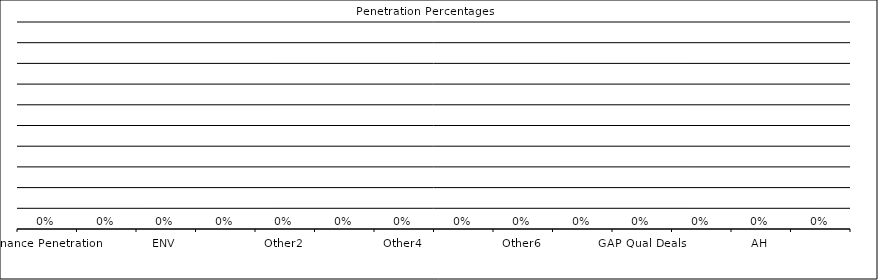
| Category | Penetration Percentages |
|---|---|
| Finance Penetration | 0 |
| VSA | 0 |
| ENV | 0 |
| T&W | 0 |
| Other2 | 0 |
| Other3 | 0 |
| Other4 | 0 |
| Other5 | 0 |
| Other6 | 0 |
| Other7 | 0 |
| GAP Qual Deals | 0 |
| GAP Fin Deals | 0 |
| AH | 0 |
| CL | 0 |